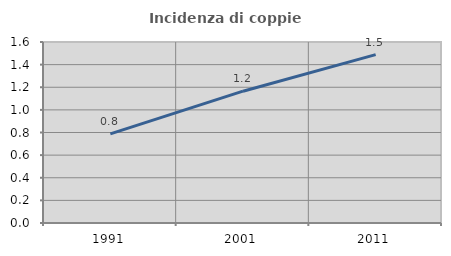
| Category | Incidenza di coppie miste |
|---|---|
| 1991.0 | 0.788 |
| 2001.0 | 1.165 |
| 2011.0 | 1.488 |